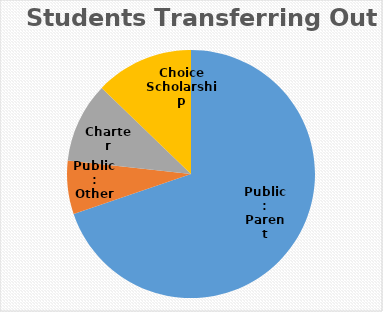
| Category | Series 0 |
|---|---|
| Public: Parent Choice | 60 |
| Public: Other | 6 |
| Charter | 9 |
| Choice Scholarship | 11 |